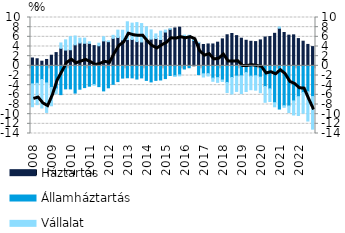
| Category | Háztartás | Államháztartás | Vállalat |
|---|---|---|---|
| 2008.0 | 1.621 | -3.735 | -4.733 |
| 2008.0 | 1.462 | -3.615 | -4.419 |
| 2008.0 | 0.957 | -2.831 | -5.899 |
| 2008.0 | 1.319 | -3.539 | -6.103 |
| 2009.0 | 2.194 | -4.467 | -3.797 |
| 2009.0 | 2.743 | -4.761 | -1.033 |
| 2009.0 | 3.627 | -5.958 | 1.105 |
| 2009.0 | 3.261 | -4.765 | 2.114 |
| 2010.0 | 3.327 | -4.778 | 2.716 |
| 2010.0 | 4.347 | -5.641 | 1.821 |
| 2010.0 | 4.73 | -4.835 | 1.004 |
| 2010.0 | 4.67 | -4.504 | 1.06 |
| 2011.0 | 4.649 | -4.21 | 0.33 |
| 2011.0 | 4.184 | -3.873 | -0.134 |
| 2011.0 | 4.155 | -4.302 | 0.529 |
| 2011.0 | 5.162 | -5.187 | 0.856 |
| 2012.0 | 4.998 | -4.547 | 0.172 |
| 2012.0 | 5.689 | -3.828 | 0.621 |
| 2012.0 | 5.868 | -3.257 | 1.516 |
| 2012.0 | 5.362 | -2.538 | 2.007 |
| 2013.0 | 5.44 | -2.468 | 3.676 |
| 2013.0 | 5.455 | -2.49 | 3.379 |
| 2013.0 | 5.016 | -2.736 | 3.932 |
| 2013.0 | 4.941 | -2.498 | 3.806 |
| 2014.0 | 5.338 | -3.016 | 2.731 |
| 2014.0 | 5.521 | -3.33 | 1.912 |
| 2014.0 | 5.659 | -3.009 | 0.941 |
| 2014.0 | 5.446 | -2.926 | 1.727 |
| 2015.0 | 6.988 | -2.638 | 0.404 |
| 2015.0 | 7.564 | -1.997 | 0.135 |
| 2015.0 | 7.841 | -2.069 | -0.142 |
| 2015.0 | 7.997 | -1.87 | -0.209 |
| 2016.0 | 6.211 | -0.655 | 0.139 |
| 2016.0 | 5.984 | -0.393 | 0.345 |
| 2016.0 | 5.236 | 0.088 | 0.174 |
| 2016.0 | 4.773 | -1.815 | 0.089 |
| 2017.0 | 4.421 | -1.653 | -0.662 |
| 2017.0 | 4.525 | -1.614 | -0.497 |
| 2017.0 | 4.526 | -2.541 | -0.659 |
| 2017.0 | 4.896 | -2.444 | -0.976 |
| 2018.0 | 5.576 | -2.93 | -0.305 |
| 2018.0 | 6.426 | -3.442 | -2.078 |
| 2018.0 | 6.694 | -2.419 | -3.404 |
| 2018.0 | 6.254 | -2.132 | -3.163 |
| 2019.0 | 5.716 | -2.076 | -3.669 |
| 2019.0 | 5.291 | -1.403 | -3.914 |
| 2019.0 | 5.076 | -2.135 | -2.807 |
| 2019.0 | 5.012 | -2.06 | -2.975 |
| 2020.0 | 5.365 | -2.345 | -3.215 |
| 2020.0 | 5.962 | -4.277 | -3.266 |
| 2020.0 | 6.06 | -4.762 | -2.612 |
| 2020.0 | 6.725 | -7.623 | -0.853 |
| 2021.0 | 7.785 | -8.938 | 0.246 |
| 2021.0 | 6.9 | -8.256 | -0.347 |
| 2021.0 | 6.348 | -8.304 | -1.365 |
| 2021.0 | 6.411 | -7.254 | -2.916 |
| 2022.0 | 5.636 | -6.383 | -3.888 |
| 2022.0 | 5.096 | -5.515 | -4.298 |
| 2022.0 | 4.43 | -5.349 | -6.071 |
| 2022.0 | 3.977 | -6.361 | -6.74 |